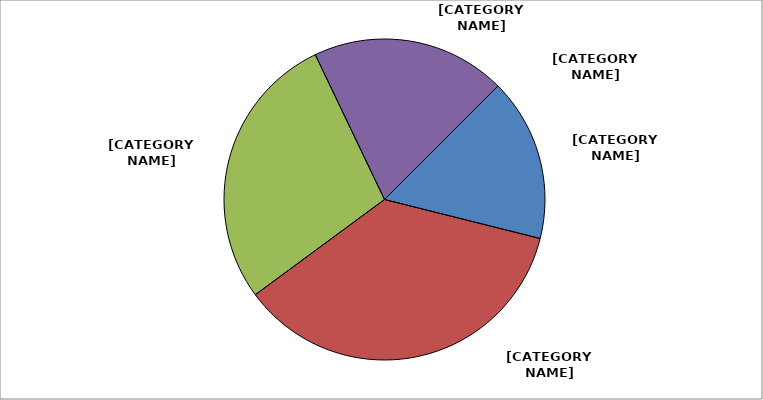
| Category | Series 0 |
|---|---|
| Local Government Contributions | 0.165 |
| Licenses, Permits & Fees | 0.361 |
| State Funded Expenditures | 0.281 |
| Federal Funded Expenditures | 0.197 |
| Other Funded Expenditures | 0 |